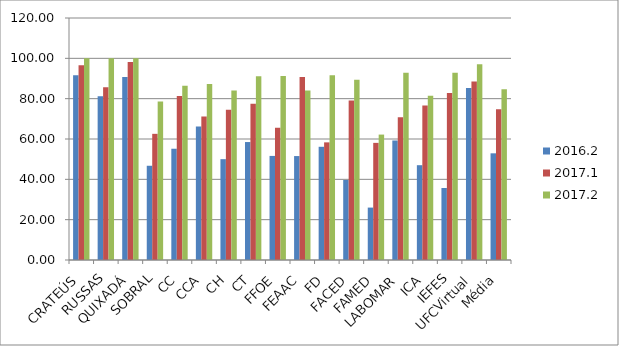
| Category | 2016.2 | 2017.1 | 2017.2 |
|---|---|---|---|
| CRATEÚS | 91.67 | 96.55 | 100 |
| RUSSAS | 81.25 | 85.71 | 100 |
| QUIXADÁ | 90.74 | 98.21 | 100 |
| SOBRAL | 46.73 | 62.56 | 78.64 |
| CC | 55.17 | 81.31 | 86.44 |
| CCA | 66.18 | 71.11 | 87.31 |
| CH | 50 | 74.51 | 84 |
| CT | 58.49 | 77.46 | 91.08 |
| FFOE | 51.61 | 65.6 | 91.2 |
| FEAAC | 51.54 | 90.77 | 84.09 |
| FD | 56.14 | 58.33 | 91.67 |
| FACED | 39.68 | 79.1 | 89.39 |
| FAMED | 25.99 | 58.08 | 62.19 |
| LABOMAR | 59.26 | 70.83 | 92.86 |
| ICA | 47.01 | 76.67 | 81.45 |
| IEFES | 35.71 | 82.76 | 92.86 |
| UFCVirtual | 85.29 | 88.57 | 97.06 |
| Média | 52.9 | 74.78 | 84.67 |